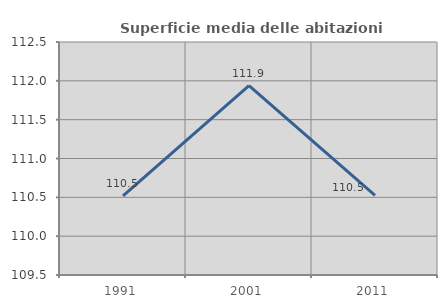
| Category | Superficie media delle abitazioni occupate |
|---|---|
| 1991.0 | 110.518 |
| 2001.0 | 111.939 |
| 2011.0 | 110.525 |